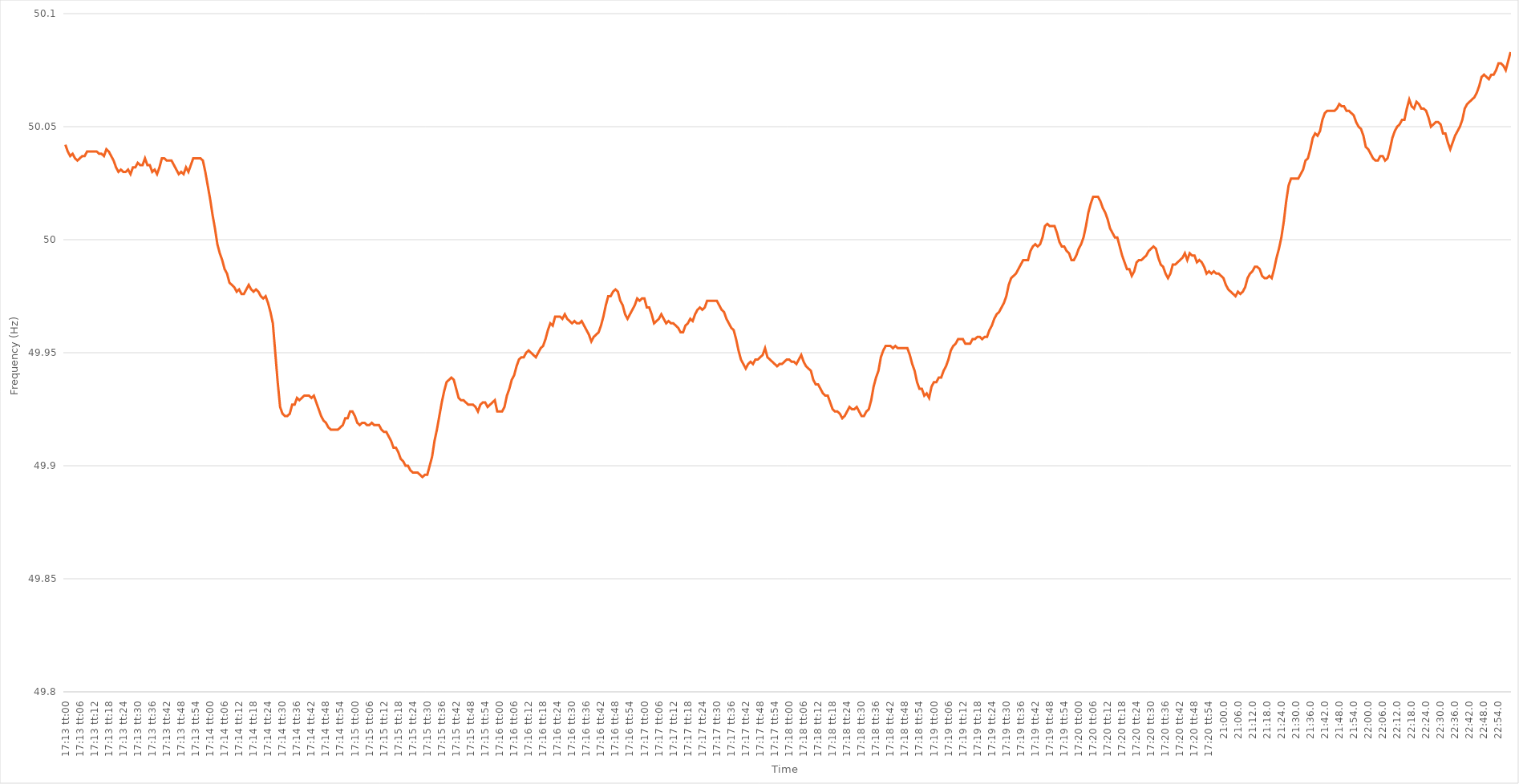
| Category | Series 0 |
|---|---|
| 0.717361111111111 | 50.042 |
| 0.7173726851851852 | 50.039 |
| 0.7173842592592593 | 50.037 |
| 0.7173958333333333 | 50.038 |
| 0.7174074074074074 | 50.036 |
| 0.7174189814814814 | 50.035 |
| 0.7174305555555556 | 50.036 |
| 0.7174421296296297 | 50.037 |
| 0.7174537037037036 | 50.037 |
| 0.7174652777777778 | 50.039 |
| 0.7174768518518518 | 50.039 |
| 0.717488425925926 | 50.039 |
| 0.7174999999999999 | 50.039 |
| 0.7175115740740741 | 50.039 |
| 0.7175231481481482 | 50.038 |
| 0.7175347222222223 | 50.038 |
| 0.7175462962962963 | 50.037 |
| 0.7175578703703703 | 50.04 |
| 0.7175694444444445 | 50.039 |
| 0.7175810185185184 | 50.037 |
| 0.7175925925925926 | 50.035 |
| 0.7176041666666667 | 50.032 |
| 0.7176157407407407 | 50.03 |
| 0.7176273148148148 | 50.031 |
| 0.7176388888888888 | 50.03 |
| 0.717650462962963 | 50.03 |
| 0.7176620370370371 | 50.031 |
| 0.717673611111111 | 50.029 |
| 0.7176851851851852 | 50.032 |
| 0.7176967592592592 | 50.032 |
| 0.7177083333333334 | 50.034 |
| 0.7177199074074073 | 50.033 |
| 0.7177314814814815 | 50.033 |
| 0.7177430555555556 | 50.036 |
| 0.7177546296296297 | 50.033 |
| 0.7177662037037037 | 50.033 |
| 0.7177777777777777 | 50.03 |
| 0.7177893518518519 | 50.031 |
| 0.717800925925926 | 50.029 |
| 0.7178125 | 50.032 |
| 0.7178240740740741 | 50.036 |
| 0.7178356481481482 | 50.036 |
| 0.7178472222222222 | 50.035 |
| 0.7178587962962962 | 50.035 |
| 0.7178703703703704 | 50.035 |
| 0.7178819444444445 | 50.033 |
| 0.7178935185185185 | 50.031 |
| 0.7179050925925926 | 50.029 |
| 0.7179166666666666 | 50.03 |
| 0.7179282407407408 | 50.029 |
| 0.7179398148148147 | 50.032 |
| 0.7179513888888889 | 50.03 |
| 0.717962962962963 | 50.033 |
| 0.7179745370370371 | 50.036 |
| 0.7179861111111111 | 50.036 |
| 0.7179976851851851 | 50.036 |
| 0.7180092592592593 | 50.036 |
| 0.7180208333333334 | 50.035 |
| 0.7180324074074074 | 50.03 |
| 0.7180439814814815 | 50.024 |
| 0.7180555555555556 | 50.018 |
| 0.7180671296296296 | 50.011 |
| 0.7180787037037036 | 50.005 |
| 0.7180902777777778 | 49.998 |
| 0.7181018518518519 | 49.994 |
| 0.7181134259259259 | 49.991 |
| 0.718125 | 49.987 |
| 0.718136574074074 | 49.985 |
| 0.7181481481481482 | 49.981 |
| 0.7181597222222221 | 49.98 |
| 0.7181712962962963 | 49.979 |
| 0.7181828703703704 | 49.977 |
| 0.7181944444444445 | 49.978 |
| 0.7182060185185185 | 49.976 |
| 0.7182175925925925 | 49.976 |
| 0.7182291666666667 | 49.978 |
| 0.7182407407407408 | 49.98 |
| 0.7182523148148148 | 49.978 |
| 0.7182638888888889 | 49.977 |
| 0.718275462962963 | 49.978 |
| 0.718287037037037 | 49.977 |
| 0.718298611111111 | 49.975 |
| 0.7183101851851852 | 49.974 |
| 0.7183217592592593 | 49.975 |
| 0.7183333333333333 | 49.972 |
| 0.7183449074074074 | 49.968 |
| 0.7183564814814815 | 49.963 |
| 0.7183680555555556 | 49.95 |
| 0.7183796296296295 | 49.937 |
| 0.7183912037037037 | 49.926 |
| 0.7184027777777778 | 49.923 |
| 0.7184143518518519 | 49.922 |
| 0.7184259259259259 | 49.922 |
| 0.7184375 | 49.923 |
| 0.7184490740740741 | 49.927 |
| 0.7184606481481483 | 49.927 |
| 0.7184722222222222 | 49.93 |
| 0.7184837962962963 | 49.929 |
| 0.7184953703703704 | 49.93 |
| 0.7185069444444445 | 49.931 |
| 0.7185185185185184 | 49.931 |
| 0.7185300925925926 | 49.931 |
| 0.7185416666666667 | 49.93 |
| 0.7185532407407407 | 49.931 |
| 0.7185648148148148 | 49.928 |
| 0.7185763888888889 | 49.925 |
| 0.718587962962963 | 49.922 |
| 0.7185995370370369 | 49.92 |
| 0.7186111111111111 | 49.919 |
| 0.7186226851851852 | 49.917 |
| 0.7186342592592593 | 49.916 |
| 0.7186458333333333 | 49.916 |
| 0.7186574074074074 | 49.916 |
| 0.7186689814814815 | 49.916 |
| 0.7186805555555557 | 49.917 |
| 0.7186921296296296 | 49.918 |
| 0.7187037037037037 | 49.921 |
| 0.7187152777777778 | 49.921 |
| 0.7187268518518519 | 49.924 |
| 0.7187384259259259 | 49.924 |
| 0.71875 | 49.922 |
| 0.7187615740740741 | 49.919 |
| 0.7187731481481481 | 49.918 |
| 0.7187847222222222 | 49.919 |
| 0.7187962962962963 | 49.919 |
| 0.7188078703703704 | 49.918 |
| 0.7188194444444443 | 49.918 |
| 0.7188310185185185 | 49.919 |
| 0.7188425925925926 | 49.918 |
| 0.7188541666666667 | 49.918 |
| 0.7188657407407407 | 49.918 |
| 0.7188773148148148 | 49.916 |
| 0.7188888888888889 | 49.915 |
| 0.7189004629629631 | 49.915 |
| 0.718912037037037 | 49.913 |
| 0.7189236111111111 | 49.911 |
| 0.7189351851851852 | 49.908 |
| 0.7189467592592593 | 49.908 |
| 0.7189583333333333 | 49.906 |
| 0.7189699074074074 | 49.903 |
| 0.7189814814814816 | 49.902 |
| 0.7189930555555555 | 49.9 |
| 0.7190046296296296 | 49.9 |
| 0.7190162037037037 | 49.898 |
| 0.7190277777777778 | 49.897 |
| 0.7190393518518517 | 49.897 |
| 0.7190509259259259 | 49.897 |
| 0.7190625 | 49.896 |
| 0.7190740740740741 | 49.895 |
| 0.7190856481481481 | 49.896 |
| 0.7190972222222222 | 49.896 |
| 0.7191087962962963 | 49.9 |
| 0.7191203703703705 | 49.904 |
| 0.7191319444444444 | 49.911 |
| 0.7191435185185185 | 49.916 |
| 0.7191550925925926 | 49.922 |
| 0.7191666666666667 | 49.928 |
| 0.7191782407407407 | 49.933 |
| 0.7191898148148148 | 49.937 |
| 0.719201388888889 | 49.938 |
| 0.719212962962963 | 49.939 |
| 0.719224537037037 | 49.938 |
| 0.7192361111111111 | 49.934 |
| 0.7192476851851852 | 49.93 |
| 0.7192592592592592 | 49.929 |
| 0.7192708333333333 | 49.929 |
| 0.7192824074074075 | 49.928 |
| 0.7192939814814815 | 49.927 |
| 0.7193055555555555 | 49.927 |
| 0.7193171296296296 | 49.927 |
| 0.7193287037037037 | 49.926 |
| 0.7193402777777779 | 49.924 |
| 0.7193518518518518 | 49.927 |
| 0.719363425925926 | 49.928 |
| 0.719375 | 49.928 |
| 0.7193865740740741 | 49.926 |
| 0.7193981481481481 | 49.927 |
| 0.7194097222222222 | 49.928 |
| 0.7194212962962964 | 49.929 |
| 0.7194328703703704 | 49.924 |
| 0.7194444444444444 | 49.924 |
| 0.7194560185185185 | 49.924 |
| 0.7194675925925926 | 49.926 |
| 0.7194791666666666 | 49.931 |
| 0.7194907407407407 | 49.934 |
| 0.7195023148148149 | 49.938 |
| 0.7195138888888889 | 49.94 |
| 0.7195254629629629 | 49.944 |
| 0.719537037037037 | 49.947 |
| 0.7195486111111111 | 49.948 |
| 0.7195601851851853 | 49.948 |
| 0.7195717592592592 | 49.95 |
| 0.7195833333333334 | 49.951 |
| 0.7195949074074074 | 49.95 |
| 0.7196064814814815 | 49.949 |
| 0.7196180555555555 | 49.948 |
| 0.7196296296296296 | 49.95 |
| 0.7196412037037038 | 49.952 |
| 0.7196527777777778 | 49.953 |
| 0.7196643518518518 | 49.956 |
| 0.7196759259259259 | 49.96 |
| 0.7196875 | 49.963 |
| 0.719699074074074 | 49.962 |
| 0.7197106481481481 | 49.966 |
| 0.7197222222222223 | 49.966 |
| 0.7197337962962963 | 49.966 |
| 0.7197453703703703 | 49.965 |
| 0.7197569444444444 | 49.967 |
| 0.7197685185185185 | 49.965 |
| 0.7197800925925927 | 49.964 |
| 0.7197916666666666 | 49.963 |
| 0.7198032407407408 | 49.964 |
| 0.7198148148148148 | 49.963 |
| 0.719826388888889 | 49.963 |
| 0.7198379629629629 | 49.964 |
| 0.719849537037037 | 49.962 |
| 0.7198611111111112 | 49.96 |
| 0.7198726851851852 | 49.958 |
| 0.7198842592592593 | 49.955 |
| 0.7198958333333333 | 49.957 |
| 0.7199074074074074 | 49.958 |
| 0.7199189814814816 | 49.959 |
| 0.7199305555555555 | 49.962 |
| 0.7199421296296297 | 49.966 |
| 0.7199537037037037 | 49.971 |
| 0.7199652777777777 | 49.975 |
| 0.7199768518518518 | 49.975 |
| 0.7199884259259259 | 49.977 |
| 0.7200000000000001 | 49.978 |
| 0.720011574074074 | 49.977 |
| 0.7200231481481482 | 49.973 |
| 0.7200347222222222 | 49.971 |
| 0.7200462962962964 | 49.967 |
| 0.7200578703703703 | 49.965 |
| 0.7200694444444444 | 49.967 |
| 0.7200810185185186 | 49.969 |
| 0.7200925925925926 | 49.971 |
| 0.7201041666666667 | 49.974 |
| 0.7201157407407407 | 49.973 |
| 0.7201273148148148 | 49.974 |
| 0.720138888888889 | 49.974 |
| 0.7201504629629629 | 49.97 |
| 0.7201620370370371 | 49.97 |
| 0.7201736111111111 | 49.967 |
| 0.7201851851851852 | 49.963 |
| 0.7201967592592592 | 49.964 |
| 0.7202083333333333 | 49.965 |
| 0.7202199074074075 | 49.967 |
| 0.7202314814814814 | 49.965 |
| 0.7202430555555556 | 49.963 |
| 0.7202546296296296 | 49.964 |
| 0.7202662037037038 | 49.963 |
| 0.7202777777777777 | 49.963 |
| 0.7202893518518518 | 49.962 |
| 0.720300925925926 | 49.961 |
| 0.7203125 | 49.959 |
| 0.7203240740740741 | 49.959 |
| 0.7203356481481481 | 49.962 |
| 0.7203472222222222 | 49.963 |
| 0.7203587962962964 | 49.965 |
| 0.7203703703703703 | 49.964 |
| 0.7203819444444445 | 49.967 |
| 0.7203935185185185 | 49.969 |
| 0.7204050925925927 | 49.97 |
| 0.7204166666666666 | 49.969 |
| 0.7204282407407407 | 49.97 |
| 0.7204398148148149 | 49.973 |
| 0.7204513888888888 | 49.973 |
| 0.720462962962963 | 49.973 |
| 0.720474537037037 | 49.973 |
| 0.7204861111111112 | 49.973 |
| 0.7204976851851851 | 49.971 |
| 0.7205092592592592 | 49.969 |
| 0.7205208333333334 | 49.968 |
| 0.7205324074074074 | 49.965 |
| 0.7205439814814815 | 49.963 |
| 0.7205555555555555 | 49.961 |
| 0.7205671296296297 | 49.96 |
| 0.7205787037037038 | 49.956 |
| 0.7205902777777777 | 49.951 |
| 0.7206018518518519 | 49.947 |
| 0.7206134259259259 | 49.945 |
| 0.7206250000000001 | 49.943 |
| 0.720636574074074 | 49.945 |
| 0.7206481481481481 | 49.946 |
| 0.7206597222222223 | 49.945 |
| 0.7206712962962962 | 49.947 |
| 0.7206828703703704 | 49.947 |
| 0.7206944444444444 | 49.948 |
| 0.7207060185185186 | 49.949 |
| 0.7207175925925925 | 49.952 |
| 0.7207291666666666 | 49.948 |
| 0.7207407407407408 | 49.947 |
| 0.7207523148148148 | 49.946 |
| 0.7207638888888889 | 49.945 |
| 0.7207754629629629 | 49.944 |
| 0.7207870370370371 | 49.945 |
| 0.7207986111111112 | 49.945 |
| 0.7208101851851851 | 49.946 |
| 0.7208217592592593 | 49.947 |
| 0.7208333333333333 | 49.947 |
| 0.7208449074074075 | 49.946 |
| 0.7208564814814814 | 49.946 |
| 0.7208680555555556 | 49.945 |
| 0.7208796296296297 | 49.947 |
| 0.7208912037037036 | 49.949 |
| 0.7209027777777778 | 49.946 |
| 0.7209143518518518 | 49.944 |
| 0.720925925925926 | 49.943 |
| 0.7209374999999999 | 49.942 |
| 0.720949074074074 | 49.938 |
| 0.7209606481481482 | 49.936 |
| 0.7209722222222222 | 49.936 |
| 0.7209837962962963 | 49.934 |
| 0.7209953703703703 | 49.932 |
| 0.7210069444444445 | 49.931 |
| 0.7210185185185186 | 49.931 |
| 0.7210300925925925 | 49.928 |
| 0.7210416666666667 | 49.925 |
| 0.7210532407407407 | 49.924 |
| 0.7210648148148149 | 49.924 |
| 0.7210763888888888 | 49.923 |
| 0.721087962962963 | 49.921 |
| 0.7210995370370371 | 49.922 |
| 0.721111111111111 | 49.924 |
| 0.7211226851851852 | 49.926 |
| 0.7211342592592592 | 49.925 |
| 0.7211458333333334 | 49.925 |
| 0.7211574074074073 | 49.926 |
| 0.7211689814814815 | 49.924 |
| 0.7211805555555556 | 49.922 |
| 0.7211921296296296 | 49.922 |
| 0.7212037037037037 | 49.924 |
| 0.7212152777777777 | 49.925 |
| 0.7212268518518519 | 49.929 |
| 0.721238425925926 | 49.935 |
| 0.72125 | 49.939 |
| 0.7212615740740741 | 49.942 |
| 0.7212731481481481 | 49.948 |
| 0.7212847222222223 | 49.951 |
| 0.7212962962962962 | 49.953 |
| 0.7213078703703704 | 49.953 |
| 0.7213194444444445 | 49.953 |
| 0.7213310185185186 | 49.952 |
| 0.7213425925925926 | 49.953 |
| 0.7213541666666666 | 49.952 |
| 0.7213657407407408 | 49.952 |
| 0.7213773148148147 | 49.952 |
| 0.7213888888888889 | 49.952 |
| 0.721400462962963 | 49.952 |
| 0.721412037037037 | 49.949 |
| 0.7214236111111111 | 49.945 |
| 0.7214351851851851 | 49.942 |
| 0.7214467592592593 | 49.937 |
| 0.7214583333333334 | 49.934 |
| 0.7214699074074074 | 49.934 |
| 0.7214814814814815 | 49.931 |
| 0.7214930555555555 | 49.932 |
| 0.7215046296296297 | 49.93 |
| 0.7215162037037036 | 49.935 |
| 0.7215277777777778 | 49.937 |
| 0.7215393518518519 | 49.937 |
| 0.721550925925926 | 49.939 |
| 0.7215625 | 49.939 |
| 0.721574074074074 | 49.942 |
| 0.7215856481481482 | 49.944 |
| 0.7215972222222223 | 49.947 |
| 0.7216087962962963 | 49.951 |
| 0.7216203703703704 | 49.953 |
| 0.7216319444444445 | 49.954 |
| 0.7216435185185185 | 49.956 |
| 0.7216550925925925 | 49.956 |
| 0.7216666666666667 | 49.956 |
| 0.7216782407407408 | 49.954 |
| 0.7216898148148148 | 49.954 |
| 0.7217013888888889 | 49.954 |
| 0.721712962962963 | 49.956 |
| 0.7217245370370371 | 49.956 |
| 0.721736111111111 | 49.957 |
| 0.7217476851851852 | 49.957 |
| 0.7217592592592593 | 49.956 |
| 0.7217708333333334 | 49.957 |
| 0.7217824074074074 | 49.957 |
| 0.7217939814814814 | 49.96 |
| 0.7218055555555556 | 49.962 |
| 0.7218171296296297 | 49.965 |
| 0.7218287037037037 | 49.967 |
| 0.7218402777777778 | 49.968 |
| 0.7218518518518519 | 49.97 |
| 0.7218634259259259 | 49.972 |
| 0.7218749999999999 | 49.975 |
| 0.7218865740740741 | 49.98 |
| 0.7218981481481482 | 49.983 |
| 0.7219097222222222 | 49.984 |
| 0.7219212962962963 | 49.985 |
| 0.7219328703703703 | 49.987 |
| 0.7219444444444445 | 49.989 |
| 0.7219560185185184 | 49.991 |
| 0.7219675925925926 | 49.991 |
| 0.7219791666666667 | 49.991 |
| 0.7219907407407408 | 49.995 |
| 0.7220023148148148 | 49.997 |
| 0.7220138888888888 | 49.998 |
| 0.722025462962963 | 49.997 |
| 0.7220370370370371 | 49.998 |
| 0.7220486111111111 | 50.001 |
| 0.7220601851851852 | 50.006 |
| 0.7220717592592593 | 50.007 |
| 0.7220833333333333 | 50.006 |
| 0.7220949074074073 | 50.006 |
| 0.7221064814814815 | 50.006 |
| 0.7221180555555556 | 50.003 |
| 0.7221296296296296 | 49.999 |
| 0.7221412037037037 | 49.997 |
| 0.7221527777777778 | 49.997 |
| 0.7221643518518519 | 49.995 |
| 0.7221759259259258 | 49.994 |
| 0.7221875 | 49.991 |
| 0.7221990740740741 | 49.991 |
| 0.7222106481481482 | 49.993 |
| 0.7222222222222222 | 49.996 |
| 0.7222337962962962 | 49.998 |
| 0.7222453703703704 | 50.001 |
| 0.7222569444444445 | 50.006 |
| 0.7222685185185185 | 50.012 |
| 0.7222800925925926 | 50.016 |
| 0.7222916666666667 | 50.019 |
| 0.7223032407407407 | 50.019 |
| 0.7223148148148147 | 50.019 |
| 0.7223263888888889 | 50.017 |
| 0.722337962962963 | 50.014 |
| 0.722349537037037 | 50.012 |
| 0.7223611111111111 | 50.009 |
| 0.7223726851851852 | 50.005 |
| 0.7223842592592593 | 50.003 |
| 0.7223958333333332 | 50.001 |
| 0.7224074074074074 | 50.001 |
| 0.7224189814814815 | 49.997 |
| 0.7224305555555556 | 49.993 |
| 0.7224421296296296 | 49.99 |
| 0.7224537037037037 | 49.987 |
| 0.7224652777777778 | 49.987 |
| 0.722476851851852 | 49.984 |
| 0.7224884259259259 | 49.986 |
| 0.7225 | 49.99 |
| 0.7225115740740741 | 49.991 |
| 0.7225231481481482 | 49.991 |
| 0.7225347222222221 | 49.992 |
| 0.7225462962962963 | 49.993 |
| 0.7225578703703704 | 49.995 |
| 0.7225694444444444 | 49.996 |
| 0.7225810185185185 | 49.997 |
| 0.7225925925925926 | 49.996 |
| 0.7226041666666667 | 49.992 |
| 0.7226157407407406 | 49.989 |
| 0.7226273148148148 | 49.988 |
| 0.7226388888888889 | 49.985 |
| 0.722650462962963 | 49.983 |
| 0.722662037037037 | 49.985 |
| 0.7226736111111111 | 49.989 |
| 0.7226851851851852 | 49.989 |
| 0.7226967592592594 | 49.99 |
| 0.7227083333333333 | 49.991 |
| 0.7227199074074074 | 49.992 |
| 0.7227314814814815 | 49.994 |
| 0.7227430555555556 | 49.991 |
| 0.7227546296296296 | 49.994 |
| 0.7227662037037037 | 49.993 |
| 0.7227777777777779 | 49.993 |
| 0.7227893518518518 | 49.99 |
| 0.7228009259259259 | 49.991 |
| 0.7228125 | 49.99 |
| 0.7228240740740741 | 49.988 |
| 0.722835648148148 | 49.985 |
| 0.7228472222222222 | 49.986 |
| 0.7228587962962963 | 49.985 |
| 0.7228703703703704 | 49.986 |
| 0.7228819444444444 | 49.985 |
| 0.7228935185185185 | 49.985 |
| 0.7229050925925926 | 49.984 |
| 0.7229166666666668 | 49.983 |
| 0.7229282407407407 | 49.98 |
| 0.7229398148148148 | 49.978 |
| 0.7229513888888889 | 49.977 |
| 0.722962962962963 | 49.976 |
| 0.722974537037037 | 49.975 |
| 0.7229861111111111 | 49.977 |
| 0.7229976851851853 | 49.976 |
| 0.7230092592592593 | 49.977 |
| 0.7230208333333333 | 49.979 |
| 0.7230324074074074 | 49.983 |
| 0.7230439814814815 | 49.985 |
| 0.7230555555555555 | 49.986 |
| 0.7230671296296296 | 49.988 |
| 0.7230787037037038 | 49.988 |
| 0.7230902777777778 | 49.987 |
| 0.7231018518518518 | 49.984 |
| 0.7231134259259259 | 49.983 |
| 0.723125 | 49.983 |
| 0.7231365740740742 | 49.984 |
| 0.7231481481481481 | 49.983 |
| 0.7231597222222222 | 49.987 |
| 0.7231712962962963 | 49.992 |
| 0.7231828703703704 | 49.996 |
| 0.7231944444444444 | 50.001 |
| 0.7232060185185185 | 50.008 |
| 0.7232175925925927 | 50.017 |
| 0.7232291666666667 | 50.024 |
| 0.7232407407407407 | 50.027 |
| 0.7232523148148148 | 50.027 |
| 0.7232638888888889 | 50.027 |
| 0.7232754629629629 | 50.027 |
| 0.723287037037037 | 50.029 |
| 0.7232986111111112 | 50.031 |
| 0.7233101851851852 | 50.035 |
| 0.7233217592592592 | 50.036 |
| 0.7233333333333333 | 50.04 |
| 0.7233449074074074 | 50.045 |
| 0.7233564814814816 | 50.047 |
| 0.7233680555555555 | 50.046 |
| 0.7233796296296297 | 50.048 |
| 0.7233912037037037 | 50.053 |
| 0.7234027777777778 | 50.056 |
| 0.7234143518518518 | 50.057 |
| 0.7234259259259259 | 50.057 |
| 0.7234375000000001 | 50.057 |
| 0.7234490740740741 | 50.057 |
| 0.7234606481481481 | 50.058 |
| 0.7234722222222222 | 50.06 |
| 0.7234837962962963 | 50.059 |
| 0.7234953703703703 | 50.059 |
| 0.7235069444444444 | 50.057 |
| 0.7235185185185186 | 50.057 |
| 0.7235300925925926 | 50.056 |
| 0.7235416666666666 | 50.055 |
| 0.7235532407407407 | 50.052 |
| 0.7235648148148148 | 50.05 |
| 0.723576388888889 | 50.049 |
| 0.7235879629629629 | 50.046 |
| 0.723599537037037 | 50.041 |
| 0.7236111111111111 | 50.04 |
| 0.7236226851851852 | 50.038 |
| 0.7236342592592592 | 50.036 |
| 0.7236458333333333 | 50.035 |
| 0.7236574074074075 | 50.035 |
| 0.7236689814814815 | 50.037 |
| 0.7236805555555555 | 50.037 |
| 0.7236921296296296 | 50.035 |
| 0.7237037037037037 | 50.036 |
| 0.7237152777777777 | 50.04 |
| 0.7237268518518518 | 50.045 |
| 0.723738425925926 | 50.048 |
| 0.72375 | 50.05 |
| 0.723761574074074 | 50.051 |
| 0.7237731481481481 | 50.053 |
| 0.7237847222222222 | 50.053 |
| 0.7237962962962964 | 50.058 |
| 0.7238078703703703 | 50.062 |
| 0.7238194444444445 | 50.059 |
| 0.7238310185185185 | 50.058 |
| 0.7238425925925926 | 50.061 |
| 0.7238541666666666 | 50.06 |
| 0.7238657407407407 | 50.058 |
| 0.7238773148148149 | 50.058 |
| 0.7238888888888889 | 50.057 |
| 0.723900462962963 | 50.054 |
| 0.723912037037037 | 50.05 |
| 0.7239236111111111 | 50.051 |
| 0.7239351851851853 | 50.052 |
| 0.7239467592592592 | 50.052 |
| 0.7239583333333334 | 50.051 |
| 0.7239699074074074 | 50.047 |
| 0.7239814814814814 | 50.047 |
| 0.7239930555555555 | 50.043 |
| 0.7240046296296296 | 50.04 |
| 0.7240162037037038 | 50.043 |
| 0.7240277777777777 | 50.046 |
| 0.7240393518518519 | 50.048 |
| 0.7240509259259259 | 50.05 |
| 0.7240625 | 50.053 |
| 0.724074074074074 | 50.058 |
| 0.7240856481481481 | 50.06 |
| 0.7240972222222223 | 50.061 |
| 0.7241087962962963 | 50.062 |
| 0.7241203703703704 | 50.063 |
| 0.7241319444444444 | 50.065 |
| 0.7241435185185185 | 50.068 |
| 0.7241550925925927 | 50.072 |
| 0.7241666666666666 | 50.073 |
| 0.7241782407407408 | 50.072 |
| 0.7241898148148148 | 50.071 |
| 0.724201388888889 | 50.073 |
| 0.7242129629629629 | 50.073 |
| 0.724224537037037 | 50.075 |
| 0.7242361111111112 | 50.078 |
| 0.7242476851851851 | 50.078 |
| 0.7242592592592593 | 50.077 |
| 0.7242708333333333 | 50.075 |
| 0.7242824074074075 | 50.079 |
| 0.7242939814814814 | 50.083 |